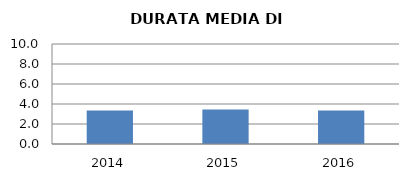
| Category | 2014 2015 2016 |
|---|---|
| 2014.0 | 3.36 |
| 2015.0 | 3.444 |
| 2016.0 | 3.348 |